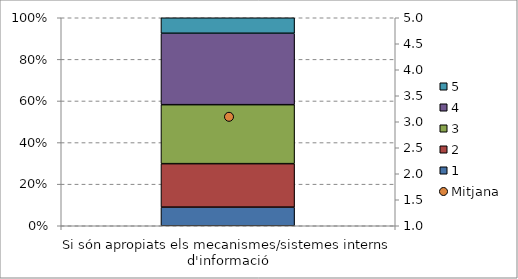
| Category | 1 | 2 | 3 | 4 | 5 |
|---|---|---|---|---|---|
| Si són apropiats els mecanismes/sistemes interns d'informació | 0.09 | 0.209 | 0.284 | 0.343 | 0.075 |